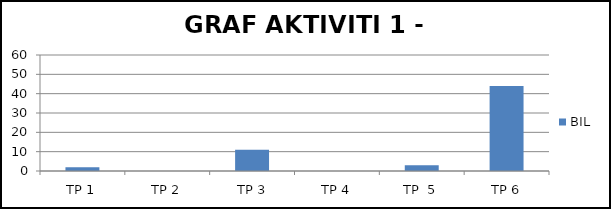
| Category | BIL |
|---|---|
| TP 1 | 2 |
| TP 2 | 0 |
|  TP 3 | 11 |
| TP 4 | 0 |
| TP  5 | 3 |
| TP 6 | 44 |